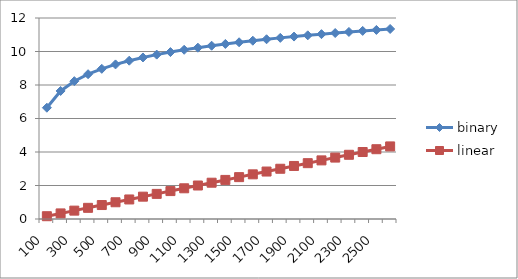
| Category | binary | linear |
|---|---|---|
| 100.0 | 6.644 | 0.167 |
| 200.0 | 7.644 | 0.333 |
| 300.0 | 8.229 | 0.5 |
| 400.0 | 8.644 | 0.667 |
| 500.0 | 8.966 | 0.833 |
| 600.0 | 9.229 | 1 |
| 700.0 | 9.451 | 1.167 |
| 800.0 | 9.644 | 1.333 |
| 900.0 | 9.814 | 1.5 |
| 1000.0 | 9.966 | 1.667 |
| 1100.0 | 10.103 | 1.833 |
| 1200.0 | 10.229 | 2 |
| 1300.0 | 10.344 | 2.167 |
| 1400.0 | 10.451 | 2.333 |
| 1500.0 | 10.551 | 2.5 |
| 1600.0 | 10.644 | 2.667 |
| 1700.0 | 10.731 | 2.833 |
| 1800.0 | 10.814 | 3 |
| 1900.0 | 10.892 | 3.167 |
| 2000.0 | 10.966 | 3.333 |
| 2100.0 | 11.036 | 3.5 |
| 2200.0 | 11.103 | 3.667 |
| 2300.0 | 11.167 | 3.833 |
| 2400.0 | 11.229 | 4 |
| 2500.0 | 11.288 | 4.167 |
| 2600.0 | 11.344 | 4.333 |